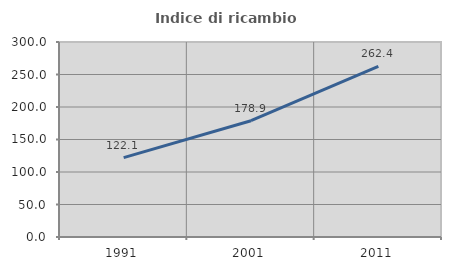
| Category | Indice di ricambio occupazionale  |
|---|---|
| 1991.0 | 122.131 |
| 2001.0 | 178.889 |
| 2011.0 | 262.353 |